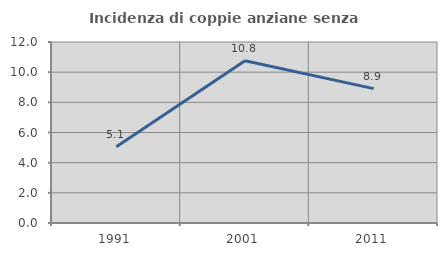
| Category | Incidenza di coppie anziane senza figli  |
|---|---|
| 1991.0 | 5.063 |
| 2001.0 | 10.753 |
| 2011.0 | 8.911 |